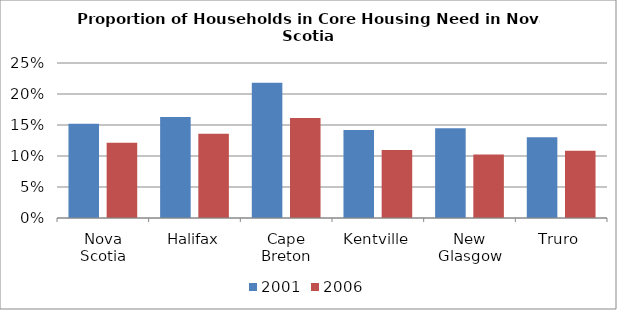
| Category | 2001 | 2006 |
|---|---|---|
| Nova Scotia | 0.152 | 0.121 |
| Halifax | 0.163 | 0.136 |
| Cape Breton | 0.218 | 0.161 |
| Kentville | 0.142 | 0.11 |
| New Glasgow | 0.145 | 0.103 |
| Truro | 0.13 | 0.109 |